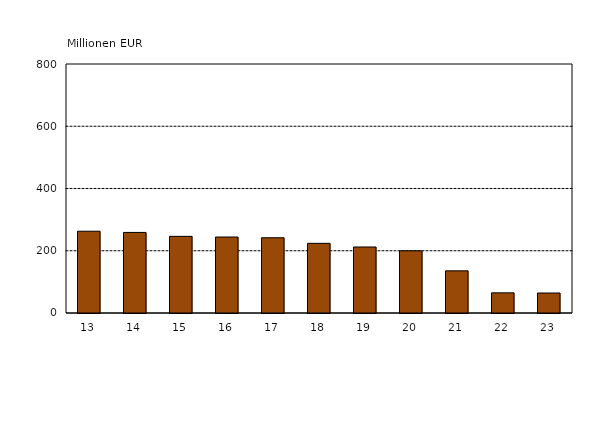
| Category | Series 0 |
|---|---|
| 13 | 262.721 |
| 14 | 258.883 |
| 15 | 246.248 |
| 16 | 244.098 |
| 17 | 241.77 |
| 18 | 223.799 |
| 19 | 212.096 |
| 20 | 199.709 |
| 21 | 135.425 |
| 22 | 64.773 |
| 23 | 64.235 |